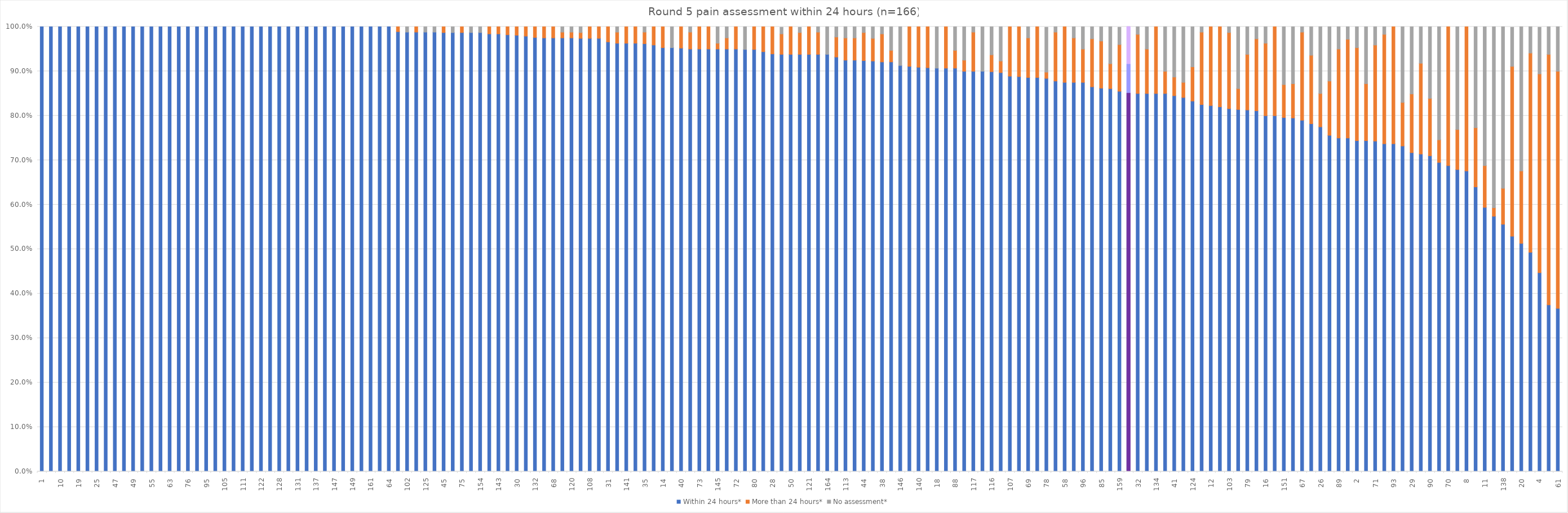
| Category | Within 24 hours* | More than 24 hours* | No assessment* |
|---|---|---|---|
| 1 | 1 | 0 | 0 |
| 9 | 1 | 0 | 0 |
| 10 | 1 | 0 | 0 |
| 13 | 1 | 0 | 0 |
| 19 | 1 | 0 | 0 |
| 24 | 1 | 0 | 0 |
| 25 | 1 | 0 | 0 |
| 39 | 1 | 0 | 0 |
| 47 | 1 | 0 | 0 |
| 48 | 1 | 0 | 0 |
| 49 | 1 | 0 | 0 |
| 53 | 1 | 0 | 0 |
| 55 | 1 | 0 | 0 |
| 57 | 1 | 0 | 0 |
| 63 | 1 | 0 | 0 |
| 65 | 1 | 0 | 0 |
| 76 | 1 | 0 | 0 |
| 82 | 1 | 0 | 0 |
| 95 | 1 | 0 | 0 |
| 97 | 1 | 0 | 0 |
| 105 | 1 | 0 | 0 |
| 110 | 1 | 0 | 0 |
| 111 | 1 | 0 | 0 |
| 118 | 1 | 0 | 0 |
| 122 | 1 | 0 | 0 |
| 127 | 1 | 0 | 0 |
| 128 | 1 | 0 | 0 |
| 129 | 1 | 0 | 0 |
| 131 | 1 | 0 | 0 |
| 136 | 1 | 0 | 0 |
| 137 | 1 | 0 | 0 |
| 142 | 1 | 0 | 0 |
| 147 | 1 | 0 | 0 |
| 148 | 1 | 0 | 0 |
| 149 | 1 | 0 | 0 |
| 157 | 1 | 0 | 0 |
| 161 | 1 | 0 | 0 |
| 166 | 1 | 0 | 0 |
| 64 | 1 | 0 | 0 |
| 37 | 0.989 | 0.011 | 0 |
| 102 | 0.988 | 0 | 0.013 |
| 112 | 0.988 | 0.013 | 0 |
| 125 | 0.988 | 0 | 0.013 |
| 165 | 0.988 | 0 | 0.013 |
| 45 | 0.987 | 0.013 | 0 |
| 56 | 0.987 | 0 | 0.013 |
| 75 | 0.987 | 0.013 | 0 |
| 144 | 0.987 | 0 | 0.013 |
| 154 | 0.987 | 0 | 0.013 |
| 101 | 0.984 | 0.016 | 0 |
| 143 | 0.984 | 0.016 | 0 |
| 60 | 0.982 | 0.018 | 0 |
| 30 | 0.981 | 0.019 | 0 |
| 3 | 0.979 | 0.021 | 0 |
| 132 | 0.976 | 0.024 | 0 |
| 54 | 0.975 | 0.025 | 0 |
| 68 | 0.975 | 0.025 | 0 |
| 115 | 0.975 | 0.013 | 0.013 |
| 120 | 0.975 | 0.013 | 0.013 |
| 33 | 0.974 | 0.013 | 0.013 |
| 108 | 0.974 | 0.026 | 0 |
| 139 | 0.974 | 0.026 | 0 |
| 31 | 0.966 | 0.034 | 0 |
| 106 | 0.963 | 0.025 | 0.013 |
| 141 | 0.963 | 0.038 | 0 |
| 163 | 0.963 | 0.038 | 0 |
| 35 | 0.962 | 0.026 | 0.013 |
| 98 | 0.959 | 0.041 | 0 |
| 14 | 0.953 | 0.047 | 0 |
| 123 | 0.953 | 0 | 0.047 |
| 40 | 0.952 | 0.048 | 0 |
| 23 | 0.95 | 0.038 | 0.013 |
| 73 | 0.95 | 0.05 | 0 |
| 74 | 0.95 | 0.05 | 0 |
| 145 | 0.95 | 0.013 | 0.038 |
| 162 | 0.95 | 0.025 | 0.025 |
| 72 | 0.95 | 0.05 | 0 |
| 17 | 0.949 | 0 | 0.051 |
| 80 | 0.949 | 0.051 | 0 |
| 155 | 0.944 | 0.056 | 0 |
| 28 | 0.939 | 0.061 | 0 |
| 43 | 0.938 | 0.046 | 0.015 |
| 50 | 0.938 | 0.062 | 0 |
| 66 | 0.938 | 0.049 | 0.012 |
| 121 | 0.938 | 0.063 | 0 |
| 135 | 0.938 | 0.05 | 0.013 |
| 164 | 0.938 | 0 | 0.063 |
| 81 | 0.932 | 0.045 | 0.023 |
| 113 | 0.925 | 0.05 | 0.025 |
| 119 | 0.925 | 0.05 | 0.025 |
| 44 | 0.924 | 0.063 | 0.013 |
| 114 | 0.923 | 0.051 | 0.026 |
| 38 | 0.921 | 0.063 | 0.016 |
| 94 | 0.921 | 0.026 | 0.053 |
| 146 | 0.913 | 0 | 0.088 |
| 156 | 0.911 | 0.089 | 0 |
| 140 | 0.909 | 0.091 | 0 |
| 130 | 0.908 | 0.092 | 0 |
| 18 | 0.907 | 0 | 0.093 |
| 77 | 0.907 | 0.093 | 0 |
| 88 | 0.907 | 0.04 | 0.053 |
| 62 | 0.9 | 0.025 | 0.075 |
| 117 | 0.9 | 0.088 | 0.013 |
| 87 | 0.9 | 0 | 0.1 |
| 116 | 0.899 | 0.038 | 0.063 |
| 152 | 0.897 | 0.026 | 0.077 |
| 107 | 0.889 | 0.111 | 0 |
| 84 | 0.888 | 0.113 | 0 |
| 69 | 0.886 | 0.089 | 0.025 |
| 133 | 0.886 | 0.114 | 0 |
| 78 | 0.884 | 0.014 | 0.101 |
| 86 | 0.878 | 0.11 | 0.012 |
| 58 | 0.875 | 0.125 | 0 |
| 91 | 0.875 | 0.1 | 0.025 |
| 96 | 0.875 | 0.075 | 0.05 |
| 99 | 0.865 | 0.108 | 0.027 |
| 85 | 0.862 | 0.106 | 0.032 |
| 46 | 0.861 | 0.056 | 0.083 |
| 159 | 0.855 | 0.105 | 0.039 |
| TNS | 0.851 | 0.065 | 0.084 |
| 32 | 0.85 | 0.133 | 0.017 |
| 83 | 0.85 | 0.1 | 0.05 |
| 134 | 0.85 | 0.15 | 0 |
| 160 | 0.85 | 0.05 | 0.1 |
| 41 | 0.845 | 0.042 | 0.113 |
| 59 | 0.841 | 0.034 | 0.125 |
| 124 | 0.833 | 0.077 | 0.09 |
| 158 | 0.825 | 0.163 | 0.013 |
| 12 | 0.823 | 0.177 | 0 |
| 126 | 0.82 | 0.18 | 0 |
| 103 | 0.816 | 0.171 | 0.013 |
| 100 | 0.814 | 0.047 | 0.14 |
| 79 | 0.813 | 0.125 | 0.063 |
| 6 | 0.811 | 0.162 | 0.027 |
| 16 | 0.8 | 0.163 | 0.038 |
| 27 | 0.8 | 0.2 | 0 |
| 151 | 0.796 | 0.074 | 0.13 |
| 36 | 0.795 | 0.077 | 0.128 |
| 67 | 0.79 | 0.198 | 0.012 |
| 42 | 0.782 | 0.154 | 0.064 |
| 26 | 0.775 | 0.075 | 0.15 |
| 104 | 0.756 | 0.122 | 0.122 |
| 89 | 0.75 | 0.2 | 0.05 |
| 5 | 0.75 | 0.222 | 0.028 |
| 2 | 0.744 | 0.209 | 0.047 |
| 153 | 0.744 | 0.128 | 0.128 |
| 71 | 0.743 | 0.216 | 0.041 |
| 7 | 0.737 | 0.246 | 0.018 |
| 93 | 0.737 | 0.263 | 0 |
| 21 | 0.732 | 0.098 | 0.171 |
| 29 | 0.717 | 0.132 | 0.151 |
| 109 | 0.714 | 0.204 | 0.082 |
| 90 | 0.71 | 0.129 | 0.161 |
| 52 | 0.695 | 0.051 | 0.254 |
| 70 | 0.688 | 0.313 | 0 |
| 22 | 0.679 | 0.09 | 0.231 |
| 8 | 0.676 | 0.324 | 0 |
| 150 | 0.64 | 0.133 | 0.227 |
| 11 | 0.594 | 0.094 | 0.313 |
| 51 | 0.574 | 0.019 | 0.407 |
| 138 | 0.556 | 0.081 | 0.364 |
| 34 | 0.529 | 0.382 | 0.088 |
| 20 | 0.513 | 0.163 | 0.325 |
| 92 | 0.493 | 0.448 | 0.06 |
| 4 | 0.447 | 0.447 | 0.105 |
| 15 | 0.375 | 0.563 | 0.063 |
| 61 | 0.367 | 0.533 | 0.1 |